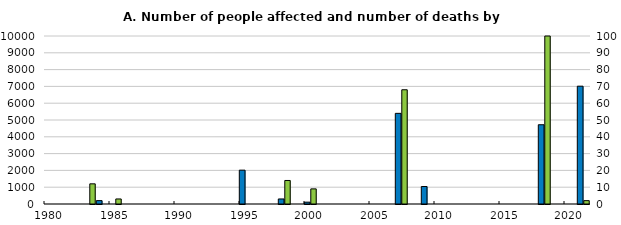
| Category | People affected (lhs) | Fake_series1 |
|---|---|---|
| 1980.0 | 0 |  |
| 1981.0 | 0 |  |
| 1982.0 | 0 |  |
| 1983.0 | 0 |  |
| 1984.0 | 200 |  |
| 1985.0 | 0 |  |
| 1986.0 | 0 |  |
| 1987.0 | 0 |  |
| 1988.0 | 0 |  |
| 1989.0 | 0 |  |
| 1990.0 | 0 |  |
| 1991.0 | 0 |  |
| 1992.0 | 0 |  |
| 1993.0 | 0 |  |
| 1994.0 | 0 |  |
| 1995.0 | 2014 |  |
| 1996.0 | 0 |  |
| 1997.0 | 0 |  |
| 1998.0 | 300 |  |
| 1999.0 | 0 |  |
| 2000.0 | 109 |  |
| 2001.0 | 0 |  |
| 2002.0 | 0 |  |
| 2003.0 | 0 |  |
| 2004.0 | 0 |  |
| 2005.0 | 0 |  |
| 2006.0 | 0 |  |
| 2007.0 | 5396 |  |
| 2008.0 | 0 |  |
| 2009.0 | 1040 |  |
| 2010.0 | 0 |  |
| 2011.0 | 0 |  |
| 2012.0 | 0 |  |
| 2013.0 | 0 |  |
| 2014.0 | 0 |  |
| 2015.0 | 0 |  |
| 2016.0 | 0 |  |
| 2017.0 | 0 |  |
| 2018.0 | 4718 |  |
| 2019.0 | 0 |  |
| 2020.0 | 0 |  |
| 2021.0 | 7012 |  |